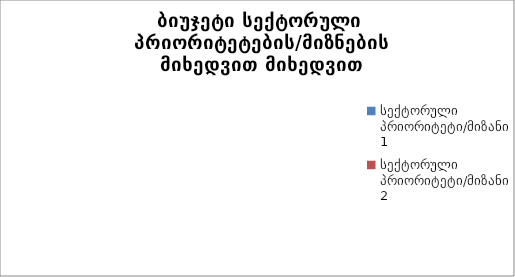
| Category | სულ |
|---|---|
| სექტორული პრიორიტეტი/მიზანი 1 | 0 |
| სექტორული პრიორიტეტი/მიზანი 2 | 0 |